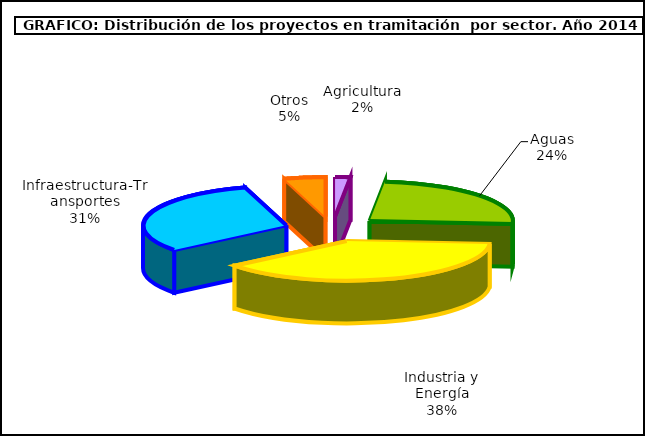
| Category | Series 0 |
|---|---|
| 0 | 7 |
| 1 | 100 |
| 2 | 156 |
| 3 | 127 |
| 4 | 19 |